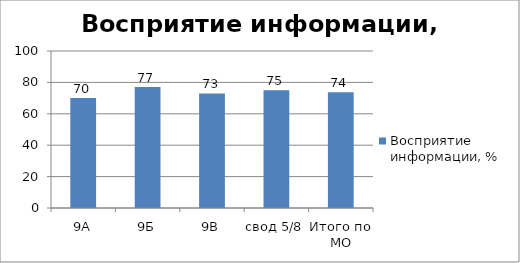
| Category | Восприятие информации, % |
|---|---|
| 9А | 70 |
| 9Б | 77 |
| 9В | 73 |
| свод 5/8 | 75 |
| Итого по МО | 73.75 |